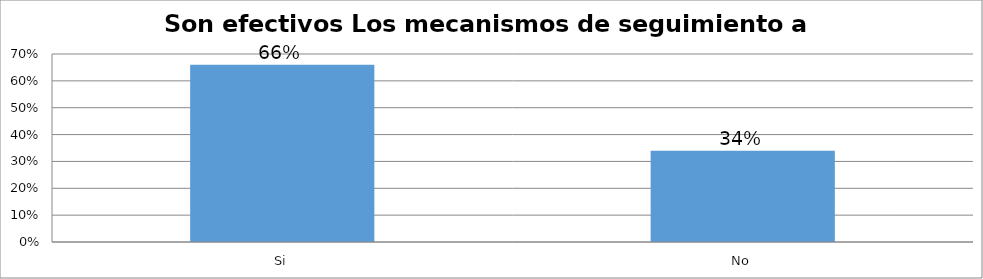
| Category | Series 0 |
|---|---|
| Si | 0.66 |
| No | 0.34 |